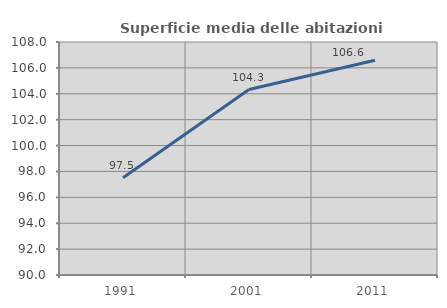
| Category | Superficie media delle abitazioni occupate |
|---|---|
| 1991.0 | 97.505 |
| 2001.0 | 104.326 |
| 2011.0 | 106.593 |